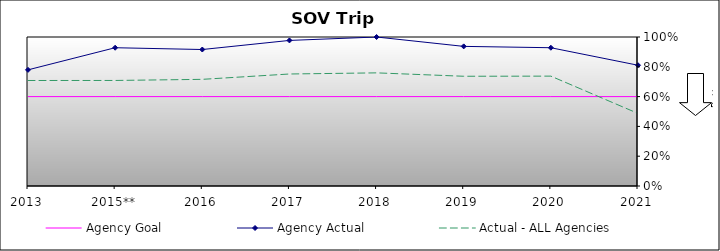
| Category | Agency Goal | Agency Actual | Actual - ALL Agencies |
|---|---|---|---|
| 2013 | 0.6 | 0.78 | 0.708 |
| 2015** | 0.6 | 0.928 | 0.708 |
| 2016 | 0.6 | 0.916 | 0.716 |
| 2017 | 0.6 | 0.977 | 0.752 |
| 2018 | 0.6 | 1 | 0.759 |
| 2019 | 0.6 | 0.937 | 0.736 |
| 2020 | 0.6 | 0.928 | 0.737 |
| 2021 | 0.6 | 0.81 | 0.487 |